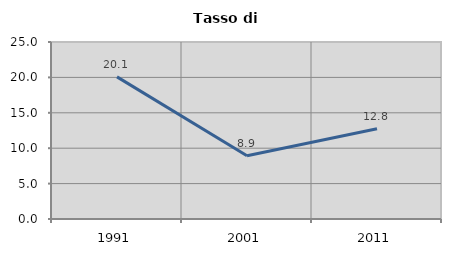
| Category | Tasso di disoccupazione   |
|---|---|
| 1991.0 | 20.07 |
| 2001.0 | 8.929 |
| 2011.0 | 12.759 |